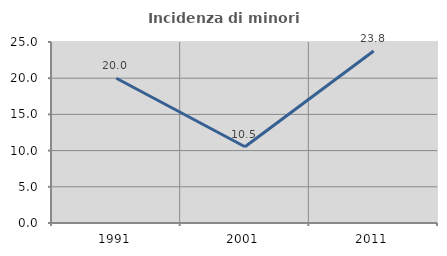
| Category | Incidenza di minori stranieri |
|---|---|
| 1991.0 | 20 |
| 2001.0 | 10.526 |
| 2011.0 | 23.762 |